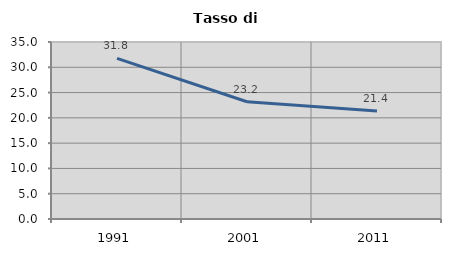
| Category | Tasso di disoccupazione   |
|---|---|
| 1991.0 | 31.755 |
| 2001.0 | 23.192 |
| 2011.0 | 21.374 |